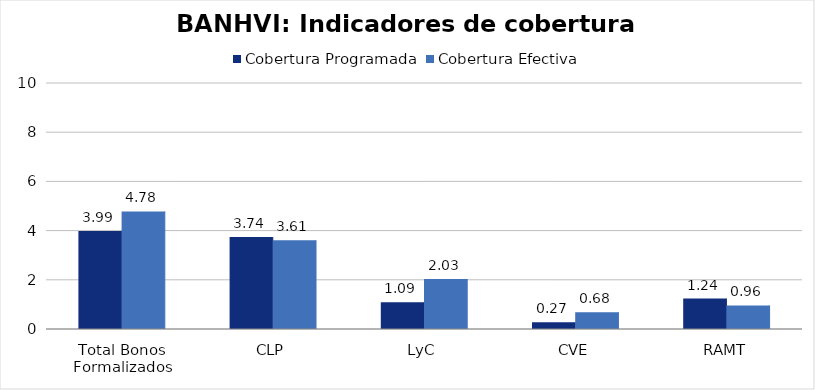
| Category | Cobertura Programada | Cobertura Efectiva |
|---|---|---|
| Total Bonos Formalizados | 3.988 | 4.781 |
| CLP | 3.736 | 3.605 |
| LyC | 1.088 | 2.032 |
| CVE | 0.271 | 0.682 |
| RAMT | 1.238 | 0.959 |